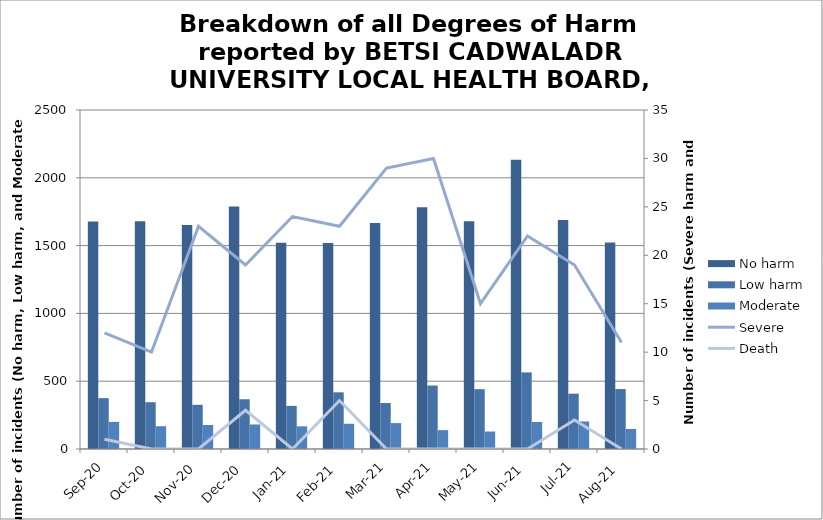
| Category | No harm | Low harm | Moderate |
|---|---|---|---|
| Sep-20 | 1677 | 375 | 200 |
| Oct-20 | 1679 | 345 | 168 |
| Nov-20 | 1652 | 326 | 177 |
| Dec-20 | 1789 | 367 | 181 |
| Jan-21 | 1521 | 318 | 167 |
| Feb-21 | 1520 | 418 | 186 |
| Mar-21 | 1667 | 339 | 191 |
| Apr-21 | 1783 | 468 | 139 |
| May-21 | 1680 | 441 | 129 |
| Jun-21 | 2134 | 565 | 199 |
| Jul-21 | 1689 | 408 | 203 |
| Aug-21 | 1522 | 442 | 148 |